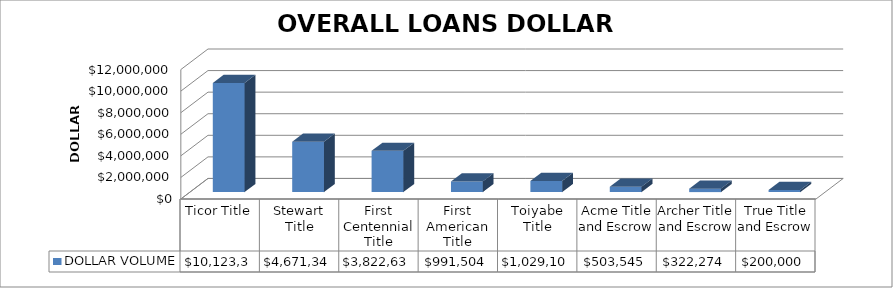
| Category | DOLLAR VOLUME |
|---|---|
| Ticor Title | 10123373.35 |
| Stewart Title | 4671347 |
| First Centennial Title | 3822631 |
| First American Title | 991503.94 |
| Toiyabe Title | 1029100 |
| Acme Title and Escrow | 503545 |
| Archer Title and Escrow | 322274 |
| True Title and Escrow | 200000 |